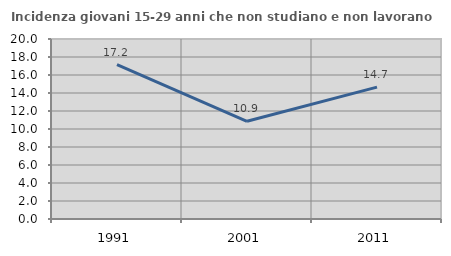
| Category | Incidenza giovani 15-29 anni che non studiano e non lavorano  |
|---|---|
| 1991.0 | 17.158 |
| 2001.0 | 10.853 |
| 2011.0 | 14.656 |